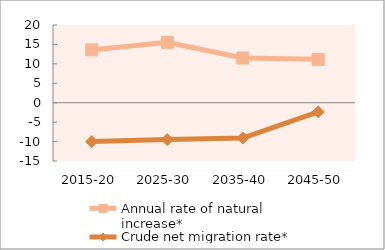
| Category | Annual rate of natural increase* | Crude net migration rate* |
|---|---|---|
| 2015-20 | 13.592 | -9.994 |
| 2025-30 | 15.549 | -9.481 |
| 2035-40 | 11.497 | -9.081 |
| 2045-50 | 11.155 | -2.365 |